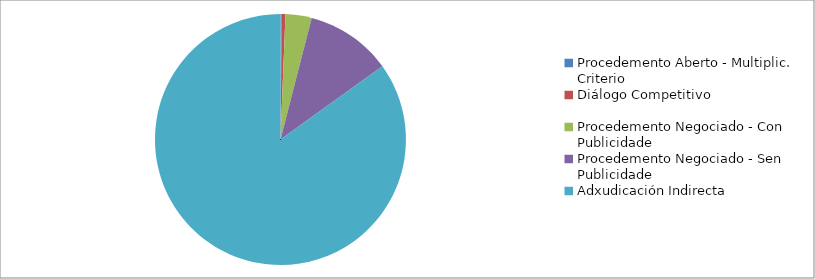
| Category | Series 0 | Series 1 |
|---|---|---|
| Procedemento Aberto - Multiplic. Criterio | 6869.68 | 0.002 |
| Diálogo Competitivo | 20236.52 | 0.005 |
| Procedemento Negociado - Con Publicidade | 143107.77 | 0.034 |
| Procedemento Negociado - Sen Publicidade | 472361.55 | 0.111 |
| Adxudicación Indirecta | 3617803.7 | 0.849 |